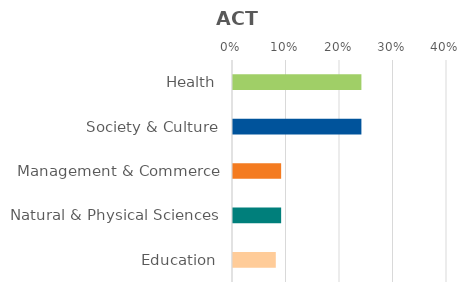
| Category | Series 0 |
|---|---|
| Health | 0.24 |
| Society & Culture | 0.24 |
| Management & Commerce | 0.09 |
| Natural & Physical Sciences | 0.09 |
| Education | 0.08 |